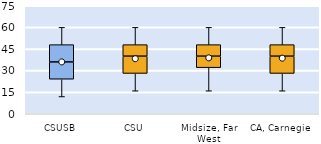
| Category | 25th | 50th | 75th |
|---|---|---|---|
| CSUSB | 24 | 12 | 12 |
| CSU | 28 | 12 | 8 |
| Midsize, Far West | 32 | 8 | 8 |
| CA, Carnegie | 28 | 12 | 8 |